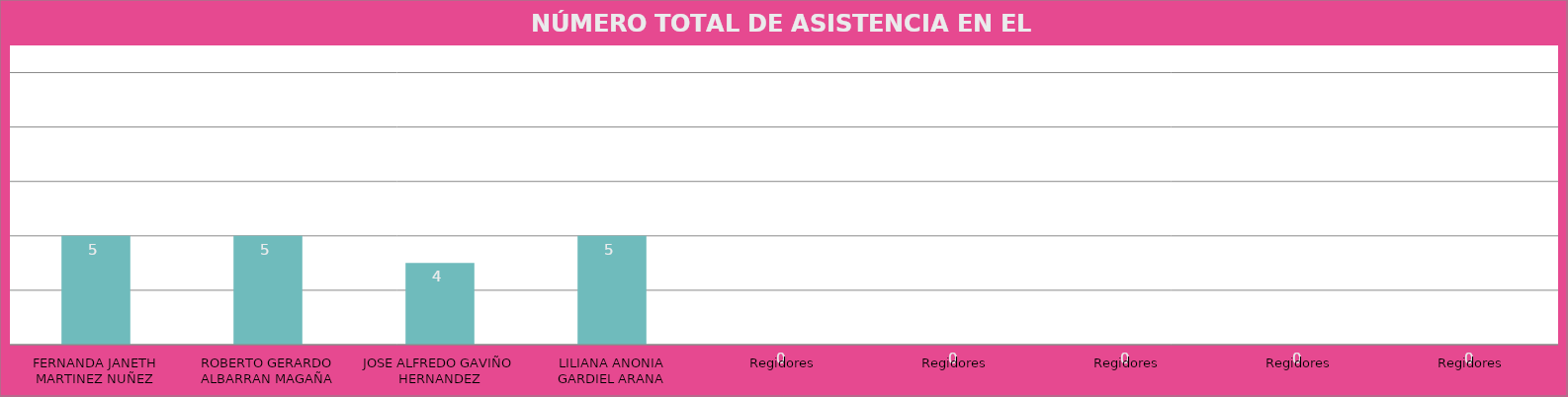
| Category | FERNANDA JANETH MARTINEZ NUÑEZ |
|---|---|
| FERNANDA JANETH MARTINEZ NUÑEZ | 5 |
| ROBERTO GERARDO ALBARRAN MAGAÑA | 5 |
| JOSE ALFREDO GAVIÑO HERNANDEZ | 4 |
| LILIANA ANONIA GARDIEL ARANA | 5 |
| Regidores | 0 |
| Regidores | 0 |
| Regidores | 0 |
| Regidores | 0 |
| Regidores | 0 |